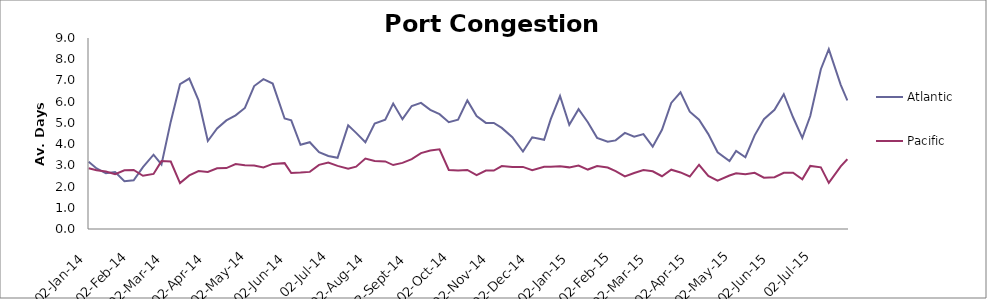
| Category | Atlantic  | Pacific |
|---|---|---|
| 2014-01-02 | 3.167 | 2.863 |
| 2014-01-08 | 2.854 | 2.767 |
| 2014-01-15 | 2.625 | 2.712 |
| 2014-01-22 | 2.688 | 2.582 |
| 2014-01-29 | 2.25 | 2.767 |
| 2014-02-05 | 2.292 | 2.781 |
| 2014-02-12 | 2.917 | 2.507 |
| 2014-02-20 | 3.5 | 2.596 |
| 2014-02-26 | 3.042 | 3.199 |
| 2014-03-05 | 5.059 | 3.178 |
| 2014-03-12 | 6.824 | 2.164 |
| 2014-03-19 | 7.088 | 2.527 |
| 2014-03-26 | 6.059 | 2.733 |
| 2014-04-02 | 4.147 | 2.692 |
| 2014-04-09 | 4.735 | 2.863 |
| 2014-04-16 | 5.118 | 2.87 |
| 2014-04-23 | 5.353 | 3.062 |
| 2014-04-30 | 5.706 | 3 |
| 2014-05-07 | 6.735 | 2.993 |
| 2014-05-14 | 7.059 | 2.904 |
| 2014-05-21 | 6.853 | 3.068 |
| 2014-05-30 | 5.206 | 3.103 |
| 2014-06-04 | 5.118 | 2.637 |
| 2014-06-11 | 3.971 | 2.658 |
| 2014-06-18 | 4.088 | 2.692 |
| 2014-06-25 | 3.618 | 3.021 |
| 2014-07-02 | 3.441 | 3.13 |
| 2014-07-09 | 3.353 | 2.973 |
| 2014-07-17 | 4.882 | 2.836 |
| 2014-07-23 | 4.529 | 2.938 |
| 2014-07-30 | 4.088 | 3.322 |
| 2014-08-06 | 4.971 | 3.205 |
| 2014-08-14 | 5.147 | 3.185 |
| 2014-08-20 | 5.912 | 3.014 |
| 2014-08-27 | 5.176 | 3.116 |
| 2014-09-03 | 5.794 | 3.295 |
| 2014-09-10 | 5.941 | 3.575 |
| 2014-09-17 | 5.618 | 3.699 |
| 2014-09-24 | 5.412 | 3.753 |
| 2014-10-01 | 5.029 | 2.781 |
| 2014-10-08 | 5.147 | 2.753 |
| 2014-10-15 | 6.059 | 2.785 |
| 2014-10-22 | 5.324 | 2.541 |
| 2014-10-29 | 5 | 2.753 |
| 2014-11-04 | 5 | 2.753 |
| 2014-11-10 | 4.765 | 2.966 |
| 2014-11-18 | 4.324 | 2.918 |
| 2014-11-26 | 3.647 | 2.925 |
| 2014-12-03 | 4.324 | 2.767 |
| 2014-12-12 | 4.206 | 2.932 |
| 2014-12-17 | 5.176 | 2.938 |
| 2014-12-24 | 6.265 | 2.952 |
| 2014-12-31 | 4.912 | 2.904 |
| 2015-01-07 | 5.647 | 2.993 |
| 2015-01-14 | 5.029 | 2.801 |
| 2015-01-21 | 4.294 | 2.966 |
| 2015-01-29 | 4.118 | 2.897 |
| 2015-02-04 | 4.176 | 2.726 |
| 2015-02-11 | 4.529 | 2.479 |
| 2015-02-18 | 4.353 | 2.637 |
| 2015-02-25 | 4.471 | 2.774 |
| 2015-03-04 | 3.882 | 2.719 |
| 2015-03-11 | 4.676 | 2.486 |
| 2015-03-18 | 5.941 | 2.795 |
| 2015-03-25 | 6.441 | 2.664 |
| 2015-04-01 | 5.529 | 2.473 |
| 2015-04-08 | 5.147 | 3.027 |
| 2015-04-15 | 4.471 | 2.5 |
| 2015-04-22 | 3.618 | 2.274 |
| 2015-05-01 | 3.206 | 2.521 |
| 2015-05-06 | 3.676 | 2.63 |
| 2015-05-13 | 3.382 | 2.575 |
| 2015-05-20 | 4.412 | 2.651 |
| 2015-05-27 | 5.176 | 2.418 |
| 2015-06-04 | 5.618 | 2.442 |
| 2015-06-11 | 6.353 | 2.645 |
| 2015-06-18 | 5.265 | 2.651 |
| 2015-06-25 | 4.294 | 2.342 |
| 2015-07-01 | 5.324 | 2.973 |
| 2015-07-09 | 7.529 | 2.904 |
| 2015-07-15 | 8.471 | 2.175 |
| 2015-07-24 | 6.794 | 2.952 |
| 2015-07-29 | 6.059 | 3.288 |